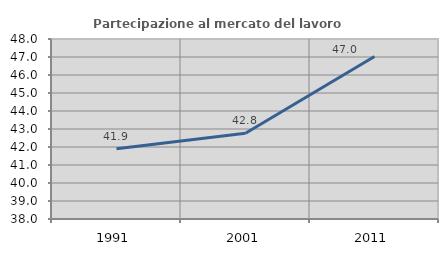
| Category | Partecipazione al mercato del lavoro  femminile |
|---|---|
| 1991.0 | 41.898 |
| 2001.0 | 42.768 |
| 2011.0 | 47.023 |